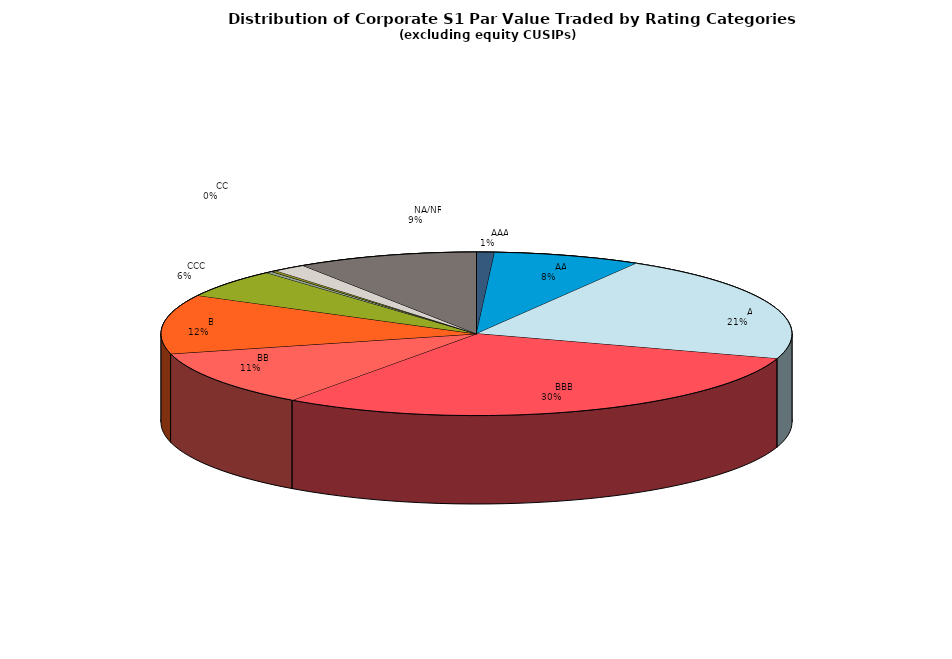
| Category | Series 0 |
|---|---|
|         AAA | 285800354.877 |
|         AA | 2355535475.665 |
|         A | 6690148634.769 |
|         BBB | 9336866109.04 |
|         BB | 3469820504.761 |
|         B | 3648692895.426 |
|         CCC | 1761254020.463 |
|         CC | 99785086.532 |
|         C | 88664305.577 |
|         D | 526761091.862 |
|         NA/NR | 2887648931.287 |